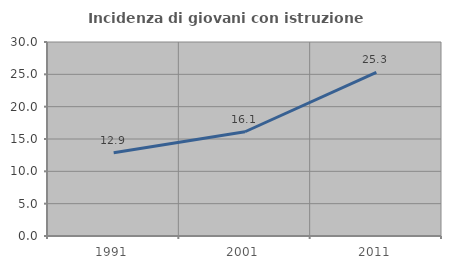
| Category | Incidenza di giovani con istruzione universitaria |
|---|---|
| 1991.0 | 12.873 |
| 2001.0 | 16.12 |
| 2011.0 | 25.302 |